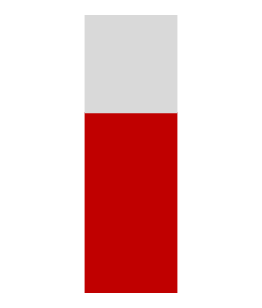
| Category | Series 0 | Series 1 |
|---|---|---|
| 0 | 0.65 | 0.35 |